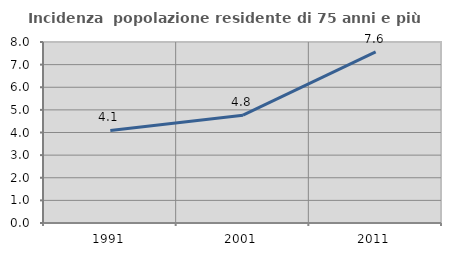
| Category | Incidenza  popolazione residente di 75 anni e più |
|---|---|
| 1991.0 | 4.092 |
| 2001.0 | 4.767 |
| 2011.0 | 7.564 |